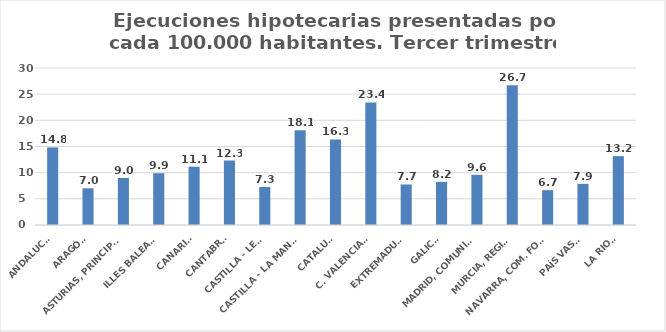
| Category | Series 0 |
|---|---|
| ANDALUCÍA | 14.823 |
| ARAGÓN | 7.017 |
| ASTURIAS, PRINCIPADO | 8.996 |
| ILLES BALEARS | 9.895 |
| CANARIAS | 11.145 |
| CANTABRIA | 12.322 |
| CASTILLA - LEÓN | 7.265 |
| CASTILLA - LA MANCHA | 18.117 |
| CATALUÑA | 16.347 |
| C. VALENCIANA | 23.409 |
| EXTREMADURA | 7.745 |
| GALICIA | 8.24 |
| MADRID, COMUNIDAD | 9.591 |
| MURCIA, REGIÓN | 26.681 |
| NAVARRA, COM. FORAL | 6.656 |
| PAÍS VASCO | 7.864 |
| LA RIOJA | 13.157 |